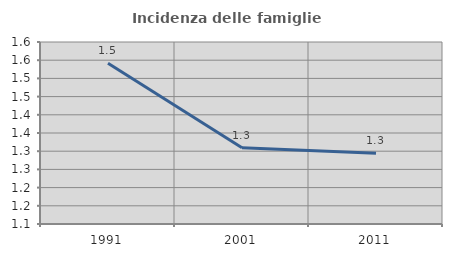
| Category | Incidenza delle famiglie numerose |
|---|---|
| 1991.0 | 1.542 |
| 2001.0 | 1.31 |
| 2011.0 | 1.294 |